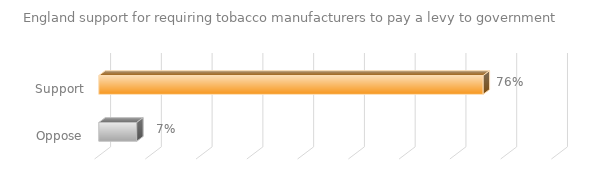
| Category | England support for requiring tobacco manufacturers to pay a levy to government |
|---|---|
| Support | 0.757 |
| Oppose | 0.075 |